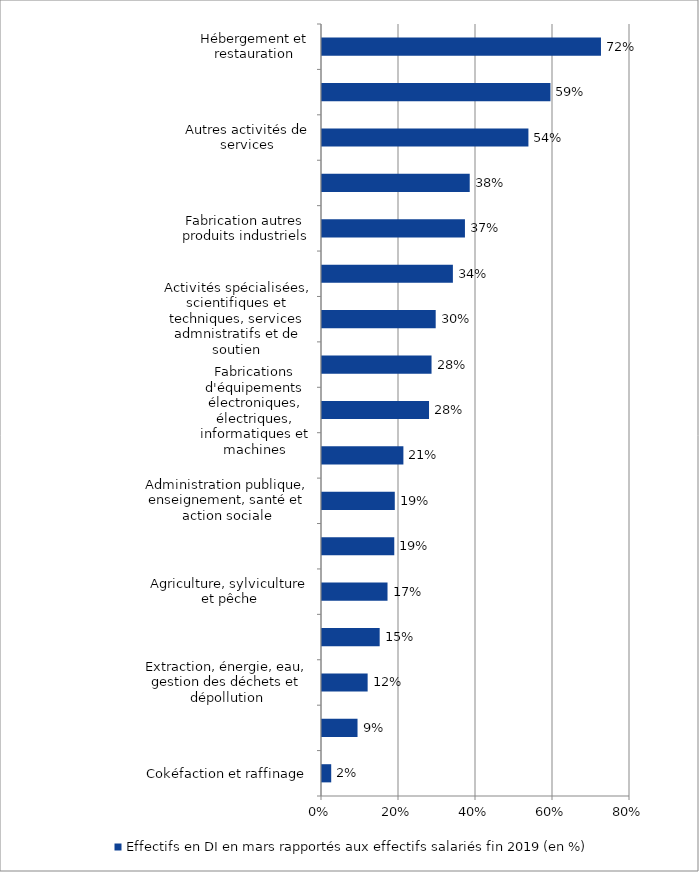
| Category | Effectifs en DI en mars rapportés aux effectifs salariés fin 2019 (en %) |
|---|---|
| Cokéfaction et raffinage | 0.024 |
| Activités financières et d'assurance | 0.092 |
| Extraction, énergie, eau, gestion des déchets et dépollution | 0.119 |
| Information et communication | 0.15 |
| Agriculture, sylviculture et pêche | 0.17 |
| Fabrication d'aliments, boissons et produits à base de tabac | 0.188 |
| Administration publique, enseignement, santé et action sociale | 0.189 |
| Transports et entreposage | 0.211 |
| Fabrications d'équipements électroniques, électriques, informatiques et machines | 0.278 |
| Activités immobilières | 0.285 |
| Activités spécialisées, scientifiques et techniques, services admnistratifs et de soutien | 0.295 |
| Fabrication de matériels de transport | 0.34 |
| Fabrication autres produits industriels | 0.371 |
| Commerce | 0.384 |
| Autres activités de services | 0.536 |
| Construction | 0.593 |
| Hébergement et restauration | 0.725 |